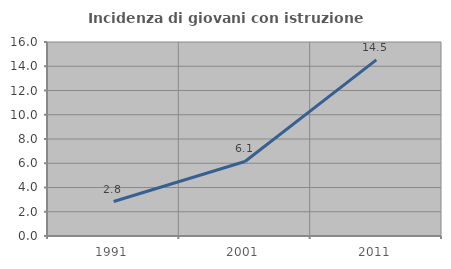
| Category | Incidenza di giovani con istruzione universitaria |
|---|---|
| 1991.0 | 2.844 |
| 2001.0 | 6.145 |
| 2011.0 | 14.523 |